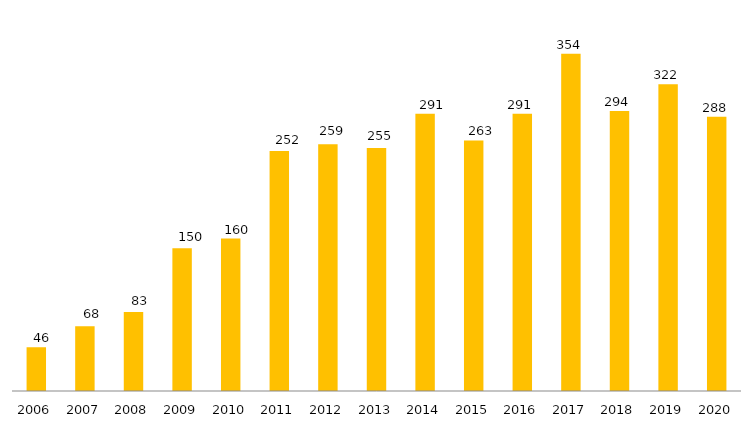
| Category | Programa |
|---|---|
| 2006.0 | 46 |
| 2007.0 | 68 |
| 2008.0 | 83 |
| 2009.0 | 150 |
| 2010.0 | 160 |
| 2011.0 | 252 |
| 2012.0 | 259 |
| 2013.0 | 255 |
| 2014.0 | 291 |
| 2015.0 | 263 |
| 2016.0 | 291 |
| 2017.0 | 354 |
| 2018.0 | 294 |
| 2019.0 | 322 |
| 2020.0 | 288 |